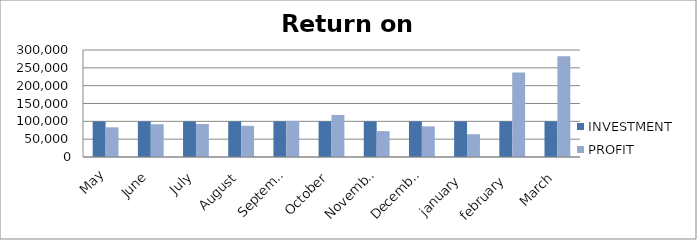
| Category | INVESTMENT  | PROFIT |
|---|---|---|
| May | 100000 | 83275 |
| June | 100000 | 91850 |
| July | 100000 | 92549 |
| August | 100000 | 87395 |
| September | 100000 | 101179 |
| October | 100000 | 117981 |
| November | 100000 | 72507 |
| December | 100000 | 85934 |
| january  | 100000 | 63911 |
| february  | 100000 | 236590 |
| March | 100000 | 282350 |